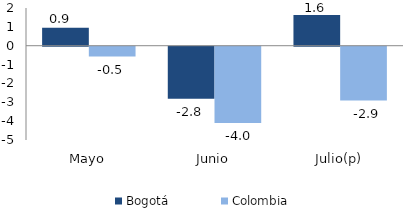
| Category | Bogotá | Colombia |
|---|---|---|
| Mayo | 0.949 | -0.522 |
| Junio | -2.763 | -4.049 |
| Julio(p) | 1.625 | -2.856 |